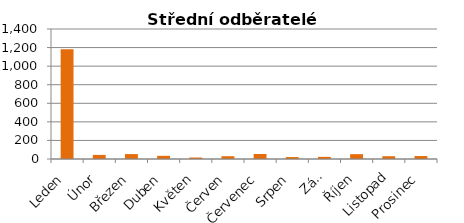
| Category | SO |
|---|---|
| Leden | 1183 |
| Únor | 44 |
| Březen | 53 |
| Duben | 34 |
| Květen | 16 |
| Červen | 30 |
| Červenec | 54 |
| Srpen | 21 |
| Září | 23 |
| Říjen | 52 |
| Listopad | 30 |
| Prosinec | 32 |